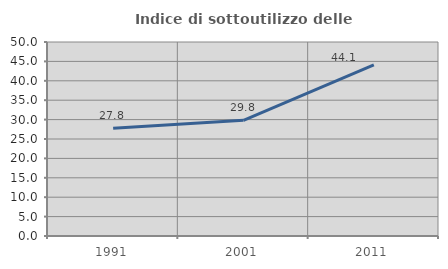
| Category | Indice di sottoutilizzo delle abitazioni  |
|---|---|
| 1991.0 | 27.783 |
| 2001.0 | 29.808 |
| 2011.0 | 44.087 |